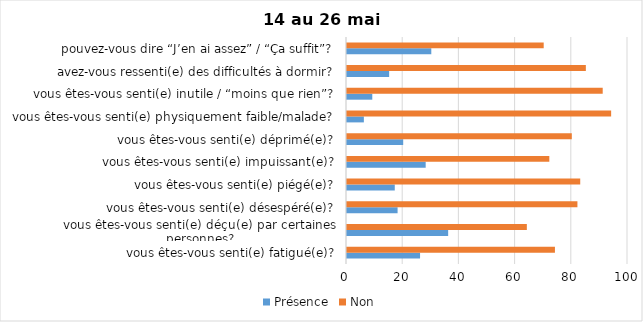
| Category | Présence | Non |
|---|---|---|
| vous êtes-vous senti(e) fatigué(e)? | 26 | 74 |
| vous êtes-vous senti(e) déçu(e) par certaines personnes? | 36 | 64 |
| vous êtes-vous senti(e) désespéré(e)? | 18 | 82 |
| vous êtes-vous senti(e) piégé(e)? | 17 | 83 |
| vous êtes-vous senti(e) impuissant(e)? | 28 | 72 |
| vous êtes-vous senti(e) déprimé(e)? | 20 | 80 |
| vous êtes-vous senti(e) physiquement faible/malade? | 6 | 94 |
| vous êtes-vous senti(e) inutile / “moins que rien”? | 9 | 91 |
| avez-vous ressenti(e) des difficultés à dormir? | 15 | 85 |
| pouvez-vous dire “J’en ai assez” / “Ça suffit”? | 30 | 70 |